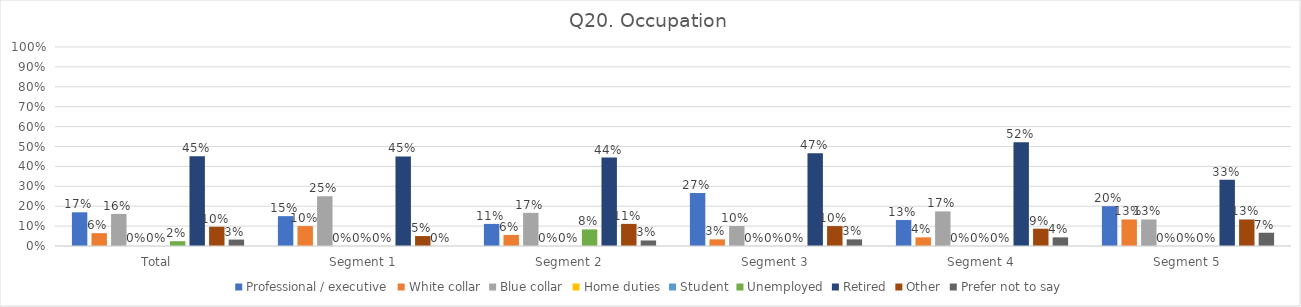
| Category | Professional / executive | White collar | Blue collar | Home duties | Student | Unemployed | Retired | Other | Prefer not to say |
|---|---|---|---|---|---|---|---|---|---|
| Total | 0.169 | 0.065 | 0.161 | 0 | 0 | 0.024 | 0.452 | 0.097 | 0.032 |
| Segment 1 | 0.15 | 0.1 | 0.25 | 0 | 0 | 0 | 0.45 | 0.05 | 0 |
| Segment 2 | 0.111 | 0.056 | 0.167 | 0 | 0 | 0.083 | 0.444 | 0.111 | 0.028 |
| Segment 3 | 0.267 | 0.033 | 0.1 | 0 | 0 | 0 | 0.467 | 0.1 | 0.033 |
| Segment 4 | 0.13 | 0.043 | 0.174 | 0 | 0 | 0 | 0.522 | 0.087 | 0.043 |
| Segment 5 | 0.2 | 0.133 | 0.133 | 0 | 0 | 0 | 0.333 | 0.133 | 0.067 |